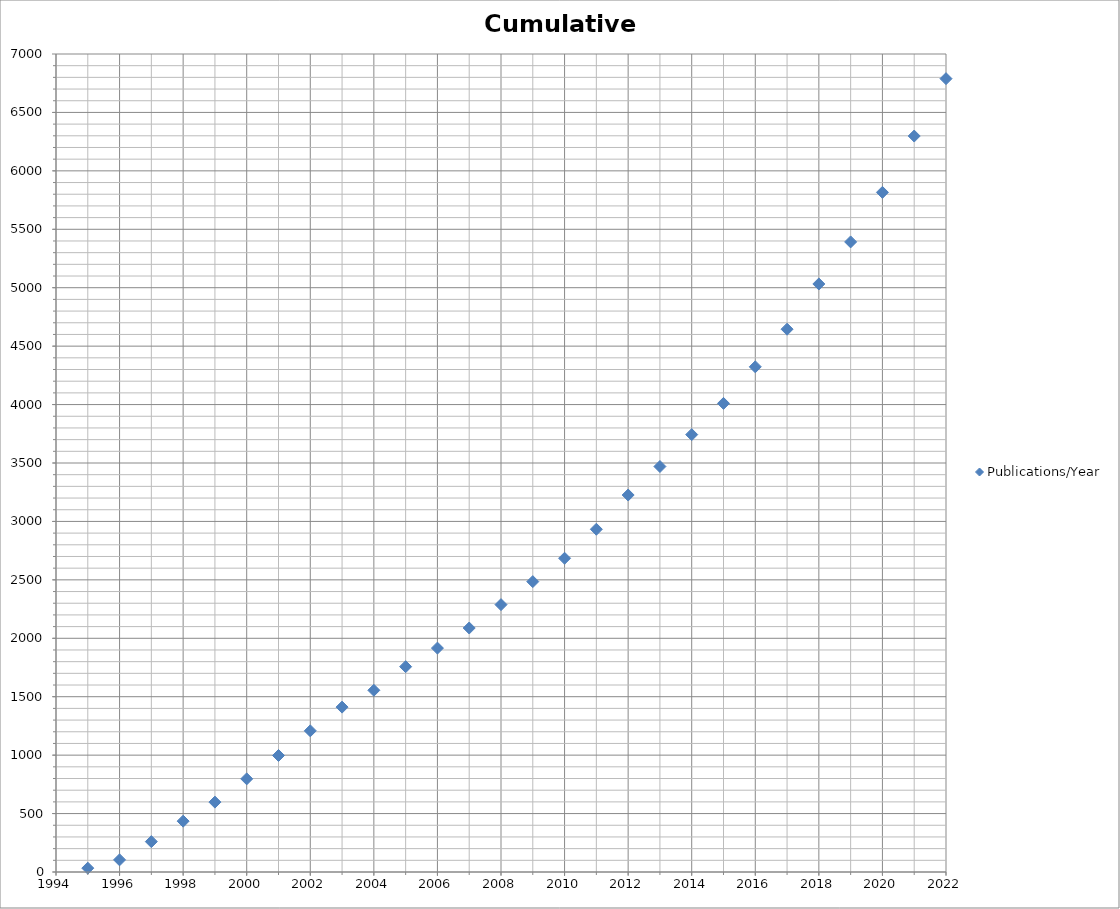
| Category | Publications/Year |
|---|---|
| 1995.0 | 33 |
| 1996.0 | 104 |
| 1997.0 | 260 |
| 1998.0 | 435 |
| 1999.0 | 598 |
| 2000.0 | 797 |
| 2001.0 | 997 |
| 2002.0 | 1208 |
| 2003.0 | 1411 |
| 2004.0 | 1555 |
| 2005.0 | 1757 |
| 2006.0 | 1916 |
| 2007.0 | 2088 |
| 2008.0 | 2288 |
| 2009.0 | 2485 |
| 2010.0 | 2685 |
| 2011.0 | 2933 |
| 2012.0 | 3226 |
| 2013.0 | 3470 |
| 2014.0 | 3743 |
| 2015.0 | 4010 |
| 2016.0 | 4323 |
| 2017.0 | 4645 |
| 2018.0 | 5032 |
| 2019.0 | 5392 |
| 2020.0 | 5816 |
| 2021.0 | 6298 |
| 2022.0 | 6789 |